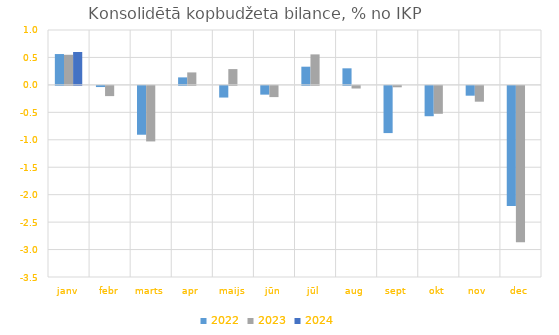
| Category | 2022 | 2023 | 2024 |
|---|---|---|---|
| janv | 0.562 | 0.549 | 0.599 |
| febr | -0.021 | -0.186 | 0 |
| marts | -0.89 | -1.012 | 0 |
| apr | 0.137 | 0.227 | 0 |
| maijs | -0.212 | 0.288 | 0 |
| jūn | -0.159 | -0.204 | 0 |
| jūl | 0.332 | 0.556 | 0 |
| aug | 0.302 | -0.048 | 0 |
| sept | -0.86 | -0.025 | 0 |
| okt | -0.553 | -0.508 | 0 |
| nov | -0.179 | -0.288 | 0 |
| dec | -2.19 | -2.848 | 0 |